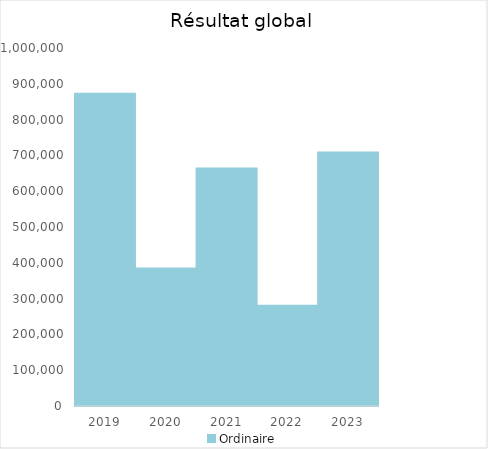
| Category |   | Ordinaire |    |
|---|---|---|---|
| 2019.0 |  | 872066.68 |  |
| 2020.0 |  | 384168.33 |  |
| 2021.0 |  | 663400.61 |  |
| 2022.0 |  | 280026.22 |  |
| 2023.0 |  | 708185.66 |  |